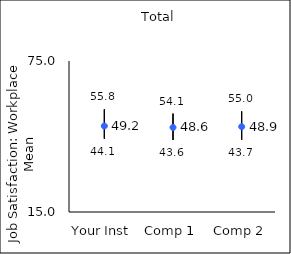
| Category | 25th percentile | 75th percentile | Mean |
|---|---|---|---|
| Your Inst | 44.1 | 55.8 | 49.16 |
| Comp 1 | 43.6 | 54.1 | 48.6 |
| Comp 2 | 43.7 | 55 | 48.9 |